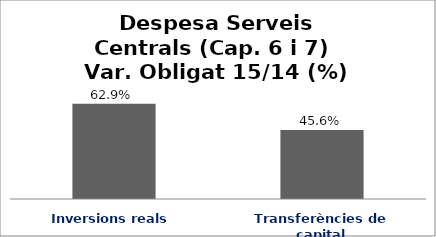
| Category | Series 0 |
|---|---|
| Inversions reals | 0.629 |
| Transferències de capital | 0.456 |